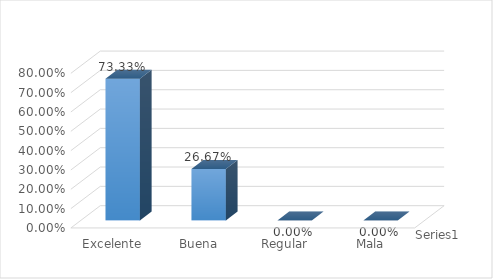
| Category | Series 0 |
|---|---|
| Excelente | 0.733 |
| Buena | 0.267 |
| Regular | 0 |
| Mala | 0 |